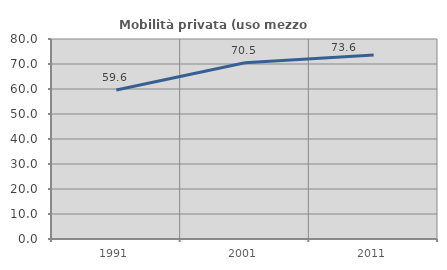
| Category | Mobilità privata (uso mezzo privato) |
|---|---|
| 1991.0 | 59.617 |
| 2001.0 | 70.485 |
| 2011.0 | 73.634 |